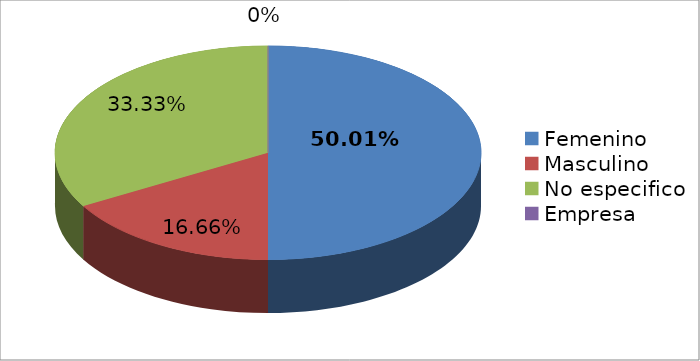
| Category | Series 0 |
|---|---|
| Femenino | 3 |
| Masculino | 1 |
| No especifico | 2 |
| Empresa | 0 |